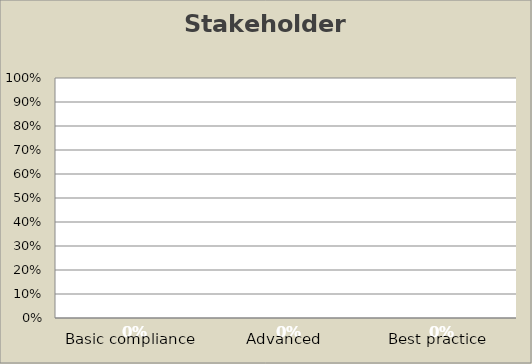
| Category | Stakeholder Engagement |
|---|---|
| Basic compliance | 0 |
| Advanced | 0 |
| Best practice | 0 |